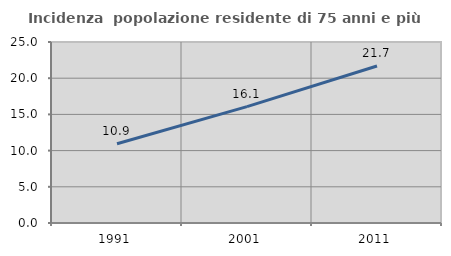
| Category | Incidenza  popolazione residente di 75 anni e più |
|---|---|
| 1991.0 | 10.942 |
| 2001.0 | 16.067 |
| 2011.0 | 21.687 |